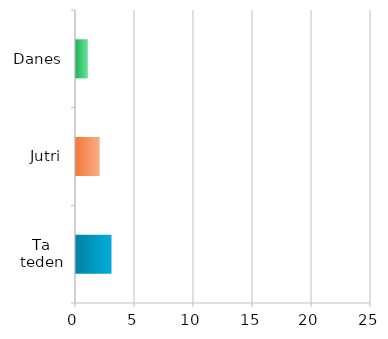
| Category | Series 0 |
|---|---|
| Ta teden | 3 |
| Jutri | 2 |
| Danes | 1 |